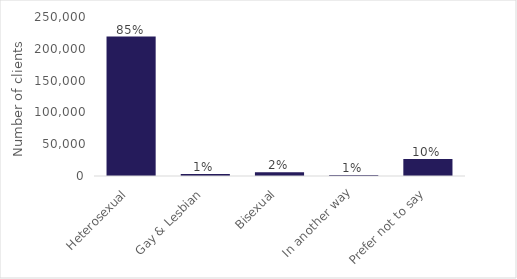
| Category | Series 0 |
|---|---|
| Heterosexual | 219260 |
| Gay & Lesbian | 3030 |
| Bisexual | 5930 |
| In another way | 1550 |
| Prefer not to say | 26815 |